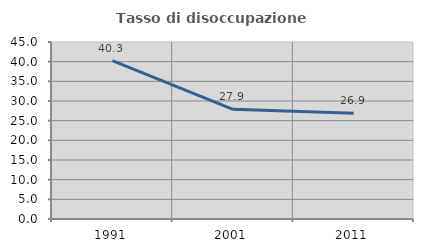
| Category | Tasso di disoccupazione giovanile  |
|---|---|
| 1991.0 | 40.286 |
| 2001.0 | 27.879 |
| 2011.0 | 26.871 |